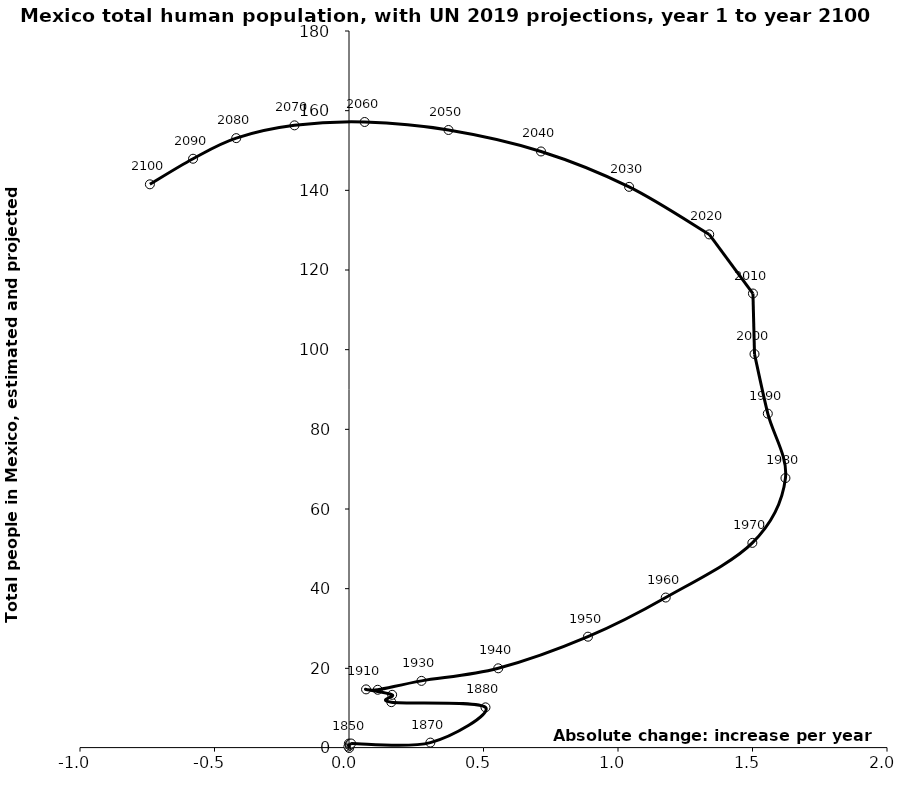
| Category | Series 0 |
|---|---|
| 0.0006619232979152142 | 0.001 |
| 0.0007364218944802851 | 0.663 |
| -0.0004910812465674812 | 1.105 |
| -0.0022098656095536654 | 0.368 |
| 0.002736885074619948 | 0.663 |
| 0.0031055978032927373 | 0.97 |
| 0.007755155045793636 | 1.129 |
| 0.3024314122643967 | 1.358 |
| 0.5074164796358638 | 10.202 |
| 0.1573573778339477 | 11.507 |
| 0.16044762559066178 | 13.349 |
| 0.06342365634017896 | 14.715 |
| 0.10668712493417595 | 14.617 |
| 0.2694401734544499 | 16.849 |
| 0.5547730496577146 | 20.006 |
| 0.888284656306829 | 27.945 |
| 1.1774448000000008 | 37.772 |
| 1.4994756499999986 | 51.494 |
| 1.6224783500000015 | 67.761 |
| 1.5569236499999994 | 83.943 |
| 1.5074915499999975 | 98.9 |
| 1.5016453999999975 | 114.093 |
| 1.3391399499999992 | 128.933 |
| 1.0413143000000034 | 140.876 |
| 0.7137528000000003 | 149.759 |
| 0.36986154999999743 | 155.151 |
| 0.0581834500000042 | 157.156 |
| -0.20260324999999427 | 156.314 |
| -0.41922895000000154 | 153.104 |
| -0.5797134500000084 | 147.93 |
| -0.7401979500000153 | 141.51 |